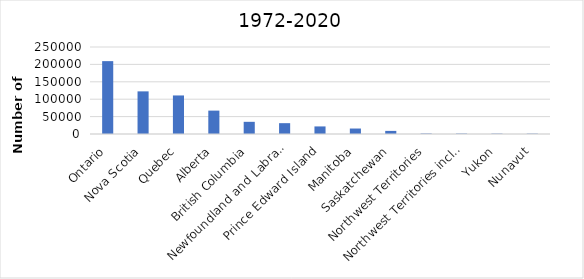
| Category | Series 0 |
|---|---|
| Ontario | 209389 |
| Nova Scotia | 122505 |
| Quebec | 110769 |
| Alberta | 67195 |
| British Columbia | 34985 |
| Newfoundland and Labrador | 31122 |
| Prince Edward Island | 21767 |
| Manitoba | 15724 |
| Saskatchewan | 8919 |
| Northwest Territories | 1360 |
| Northwest Territories including Nunavut | 1214 |
| Yukon | 1036 |
| Nunavut | 991 |